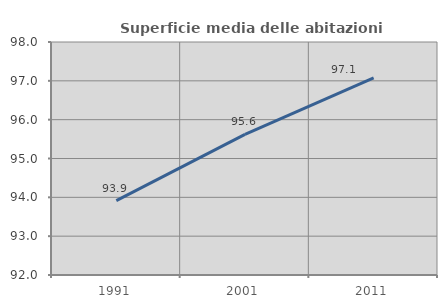
| Category | Superficie media delle abitazioni occupate |
|---|---|
| 1991.0 | 93.916 |
| 2001.0 | 95.62 |
| 2011.0 | 97.075 |